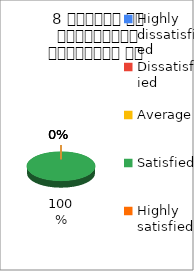
| Category | 8 शिक्षक का सम्प्रेषण सुस्पष्ठ है  |
|---|---|
| Highly dissatisfied | 0 |
| Dissatisfied | 0 |
| Average | 0 |
| Satisfied | 1 |
| Highly satisfied | 0 |